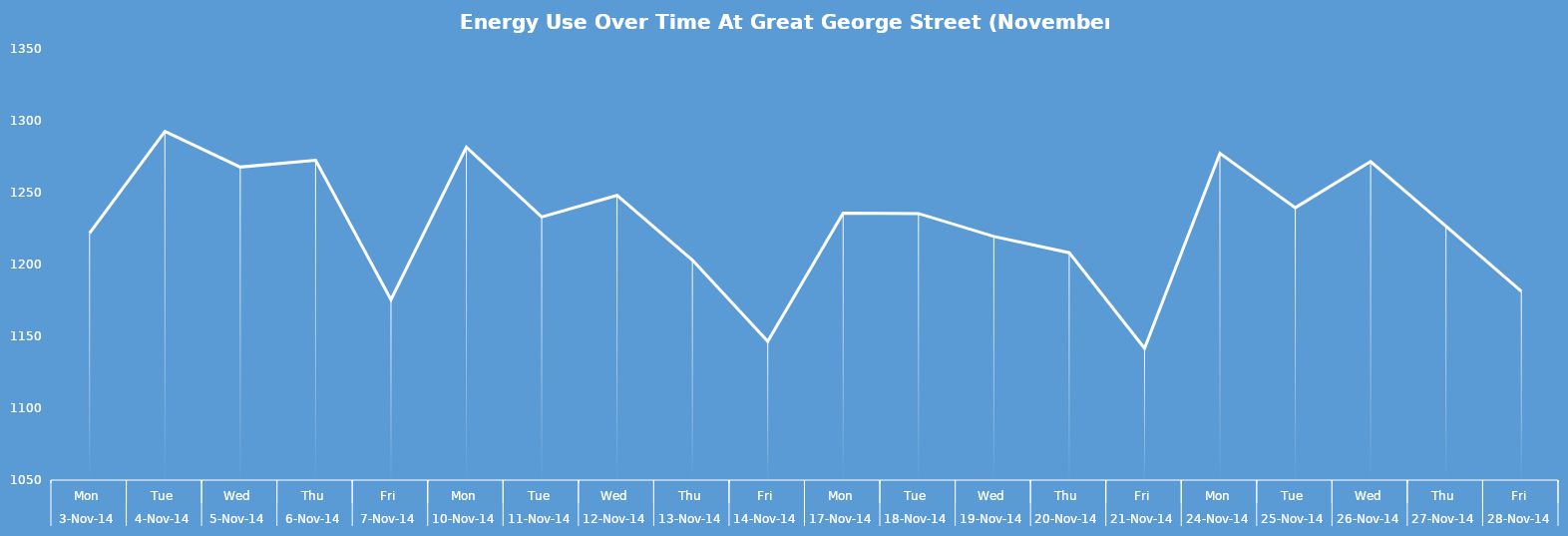
| Category | Total KwH |
|---|---|
| 0 | 1221.8 |
| 1 | 1292.6 |
| 2 | 1267.8 |
| 3 | 1272.5 |
| 4 | 1175.5 |
| 5 | 1281.7 |
| 6 | 1233.1 |
| 7 | 1248.1 |
| 8 | 1203.1 |
| 9 | 1146.6 |
| 10 | 1235.7 |
| 11 | 1235.5 |
| 12 | 1219.5 |
| 13 | 1208.2 |
| 14 | 1141.7 |
| 15 | 1277.4 |
| 16 | 1239.5 |
| 17 | 1271.7 |
| 18 | 1226.7 |
| 19 | 1181.3 |